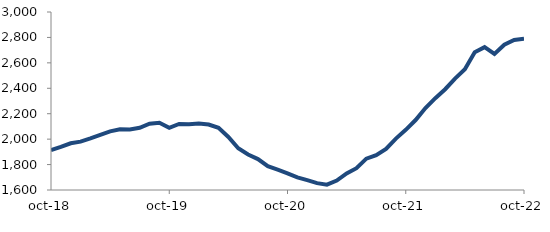
| Category | Series 0 |
|---|---|
| 2018-10-01 | 1913.466 |
| 2018-11-01 | 1938.846 |
| 2018-12-01 | 1967.481 |
| 2019-01-01 | 1980.122 |
| 2019-02-01 | 2005.664 |
| 2019-03-01 | 2033.637 |
| 2019-04-01 | 2060.76 |
| 2019-05-01 | 2078.07 |
| 2019-06-01 | 2076.377 |
| 2019-07-01 | 2089.152 |
| 2019-08-01 | 2121.901 |
| 2019-09-01 | 2128.491 |
| 2019-10-01 | 2088.553 |
| 2019-11-01 | 2119.211 |
| 2019-12-01 | 2116.27 |
| 2020-01-01 | 2123.179 |
| 2020-02-01 | 2115.217 |
| 2020-03-01 | 2088.6 |
| 2020-04-01 | 2017.241 |
| 2020-05-01 | 1928.116 |
| 2020-06-01 | 1878.979 |
| 2020-07-01 | 1843.29 |
| 2020-08-01 | 1787.543 |
| 2020-09-01 | 1760.281 |
| 2020-10-01 | 1731.197 |
| 2020-11-01 | 1698.835 |
| 2020-12-01 | 1677.184 |
| 2021-01-01 | 1654.072 |
| 2021-02-01 | 1641.869 |
| 2021-03-01 | 1673.821 |
| 2021-04-01 | 1730.759 |
| 2021-05-01 | 1771.425 |
| 2021-06-01 | 1846.573 |
| 2021-07-01 | 1874.111 |
| 2021-08-01 | 1922.894 |
| 2021-09-01 | 2004.225 |
| 2021-10-01 | 2073.331 |
| 2021-11-01 | 2150.314 |
| 2021-12-01 | 2244.492 |
| 2022-01-01 | 2321.95 |
| 2022-02-01 | 2392.65 |
| 2022-03-01 | 2476.383 |
| 2022-04-01 | 2549.069 |
| 2022-05-01 | 2683.336 |
| 2022-06-01 | 2723.868 |
| 2022-07-01 | 2670.585 |
| 2022-08-01 | 2742.913 |
| 2022-09-01 | 2780.46 |
| 2022-10-01 | 2788.916 |